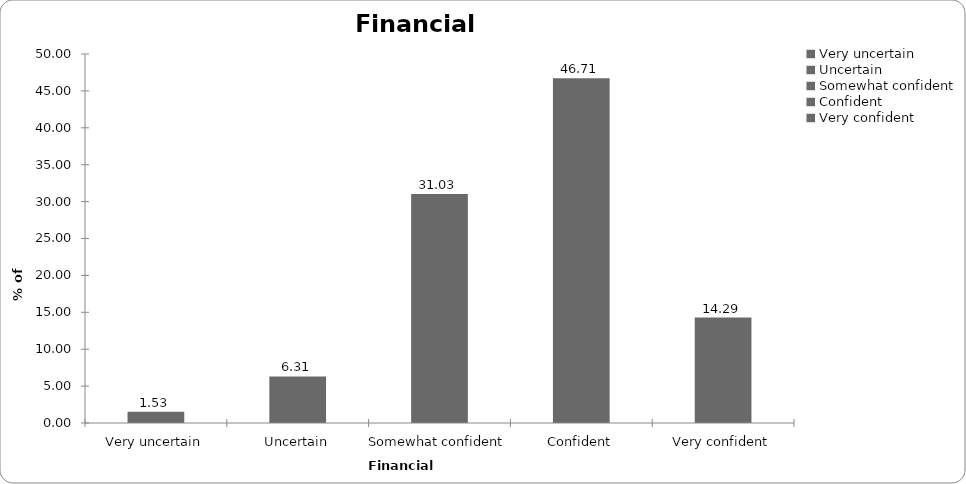
| Category | Financial confidence |
|---|---|
| Very uncertain | 1.528 |
| Uncertain | 6.312 |
| Somewhat confident | 31.03 |
| Confident | 46.711 |
| Very confident | 14.286 |